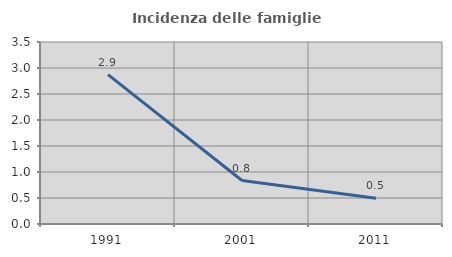
| Category | Incidenza delle famiglie numerose |
|---|---|
| 1991.0 | 2.874 |
| 2001.0 | 0.836 |
| 2011.0 | 0.496 |